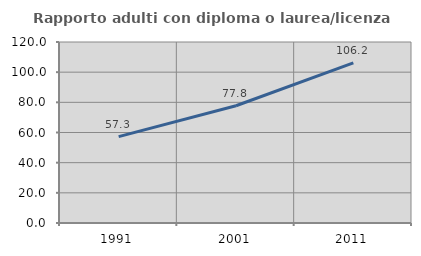
| Category | Rapporto adulti con diploma o laurea/licenza media  |
|---|---|
| 1991.0 | 57.282 |
| 2001.0 | 77.757 |
| 2011.0 | 106.162 |